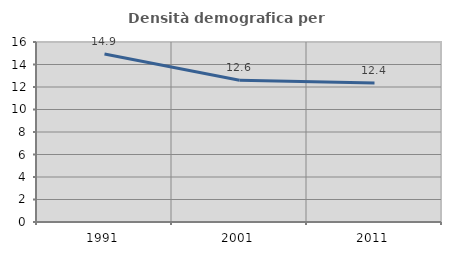
| Category | Densità demografica |
|---|---|
| 1991.0 | 14.928 |
| 2001.0 | 12.603 |
| 2011.0 | 12.359 |